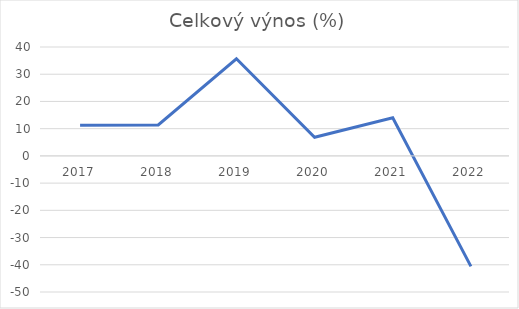
| Category | Celkový výnos (%) |
|---|---|
| 2017.0 | 11.3 |
| 2018.0 | 11.36 |
| 2019.0 | 35.69 |
| 2020.0 | 6.82 |
| 2021.0 | 14 |
| 2022.0 | -40.6 |